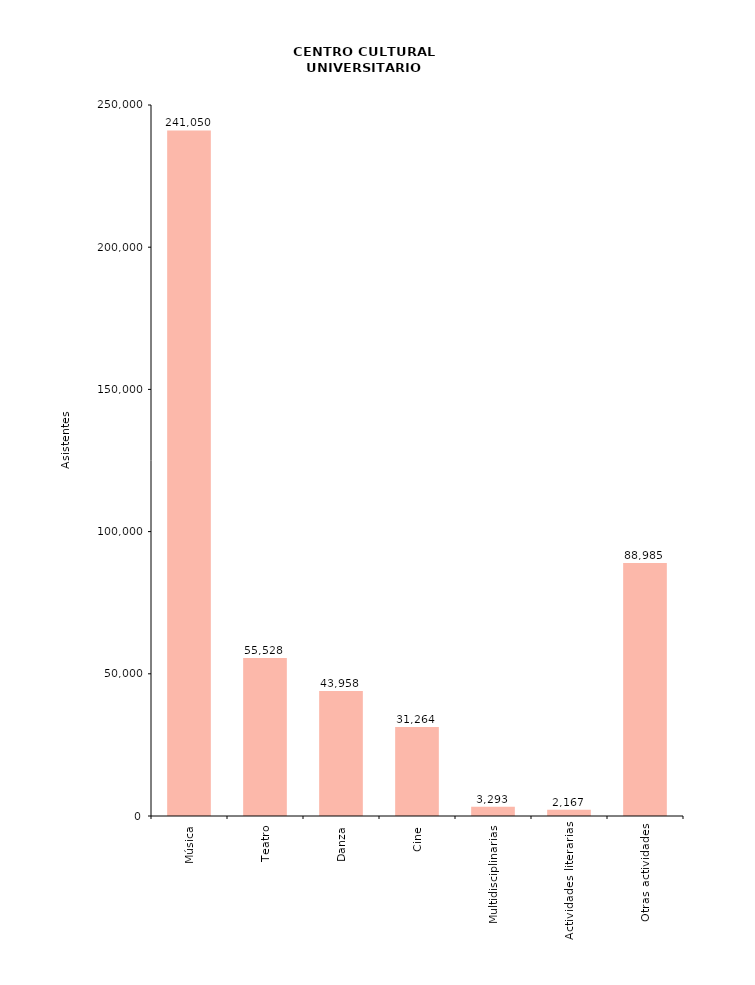
| Category | Series 0 |
|---|---|
| Música | 241050 |
| Teatro | 55528 |
| Danza | 43958 |
| Cine | 31264 |
| Multidisciplinarias | 3293 |
| Actividades literarias | 2167 |
| Otras actividades | 88985 |